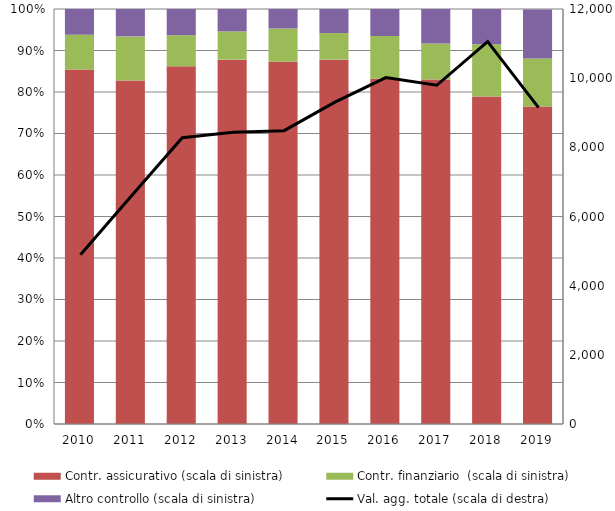
| Category | Contr. assicurativo (scala di sinistra) | Contr. finanziario  (scala di sinistra) | Altro controllo (scala di sinistra) |
|---|---|---|---|
| 2010.0 | 0.854 | 0.084 | 0.062 |
| 2011.0 | 0.828 | 0.106 | 0.066 |
| 2012.0 | 0.862 | 0.075 | 0.063 |
| 2013.0 | 0.878 | 0.068 | 0.054 |
| 2014.0 | 0.873 | 0.08 | 0.047 |
| 2015.0 | 0.878 | 0.064 | 0.059 |
| 2016.0 | 0.832 | 0.103 | 0.065 |
| 2017.0 | 0.83 | 0.087 | 0.083 |
| 2018.0 | 0.789 | 0.126 | 0.086 |
| 2019.0 | 0.765 | 0.116 | 0.118 |